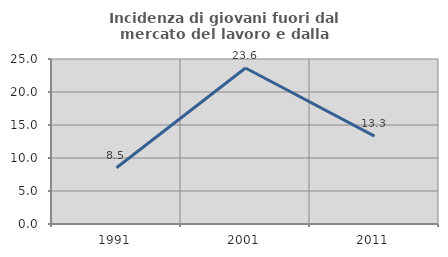
| Category | Incidenza di giovani fuori dal mercato del lavoro e dalla formazione  |
|---|---|
| 1991.0 | 8.532 |
| 2001.0 | 23.631 |
| 2011.0 | 13.316 |